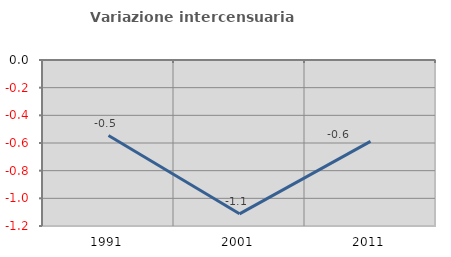
| Category | Variazione intercensuaria annua |
|---|---|
| 1991.0 | -0.546 |
| 2001.0 | -1.112 |
| 2011.0 | -0.588 |